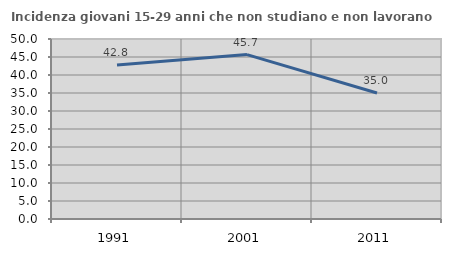
| Category | Incidenza giovani 15-29 anni che non studiano e non lavorano  |
|---|---|
| 1991.0 | 42.77 |
| 2001.0 | 45.665 |
| 2011.0 | 35 |